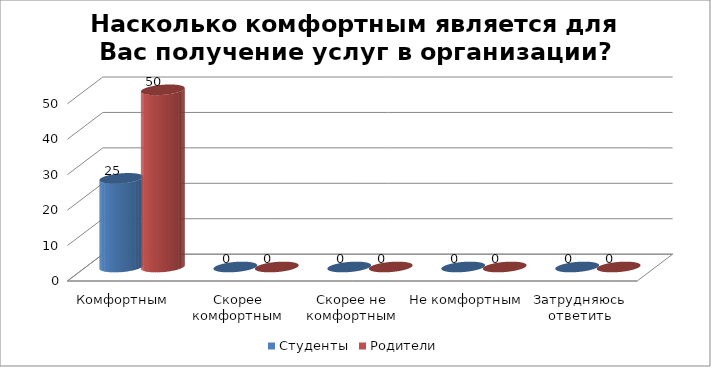
| Category | Студенты | Родители |
|---|---|---|
| Комфортным | 25 | 50 |
| Скорее комфортным | 0 | 0 |
| Скорее не комфортным | 0 | 0 |
| Не комфортным | 0 | 0 |
| Затрудняюсь ответить | 0 | 0 |